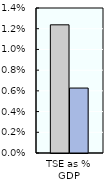
| Category | 2000-02 | 2018-20 |
|---|---|---|
| TSE as % GDP | 0.012 | 0.006 |